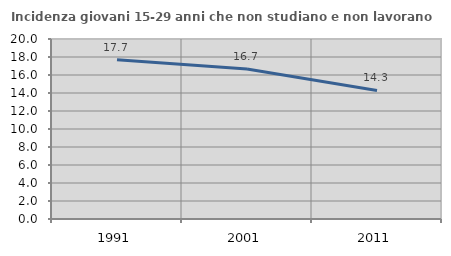
| Category | Incidenza giovani 15-29 anni che non studiano e non lavorano  |
|---|---|
| 1991.0 | 17.689 |
| 2001.0 | 16.667 |
| 2011.0 | 14.286 |